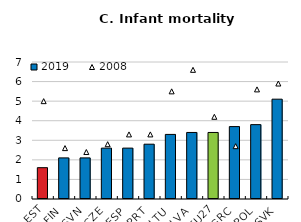
| Category | 2019 |
|---|---|
| EST | 1.6 |
| FIN | 2.1 |
| SVN | 2.1 |
| CZE | 2.6 |
| ESP | 2.6 |
| PRT | 2.8 |
| LTU | 3.3 |
| LVA | 3.4 |
| EU27 | 3.4 |
| GRC | 3.7 |
| POL | 3.8 |
| SVK | 5.1 |